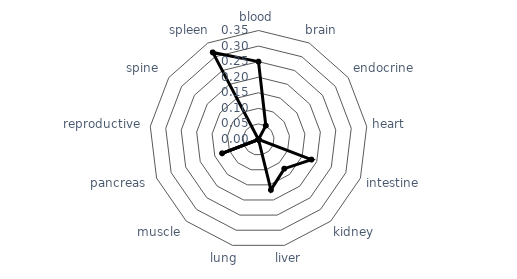
| Category | Series 0 |
|---|---|
| blood | 0.25 |
| brain | 0.051 |
| endocrine | 0 |
| heart | 0 |
| intestine | 0.182 |
| kidney | 0.125 |
| liver | 0.167 |
| lung | 0 |
| muscle | 0 |
| pancreas | 0.125 |
| reproductive | 0 |
| spine | 0 |
| spleen | 0.316 |